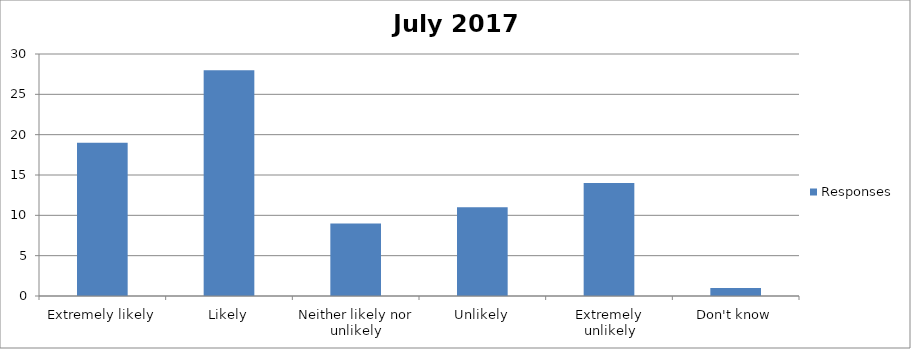
| Category | Responses |
|---|---|
| Extremely likely | 19 |
| Likely | 28 |
| Neither likely nor unlikely | 9 |
| Unlikely | 11 |
| Extremely unlikely | 14 |
| Don't know | 1 |